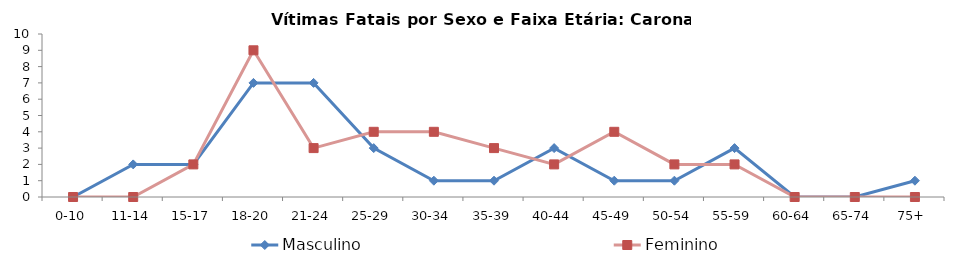
| Category | Masculino | Feminino |
|---|---|---|
| 0-10 | 0 | 0 |
| 11-14 | 2 | 0 |
| 15-17 | 2 | 2 |
| 18-20 | 7 | 9 |
| 21-24 | 7 | 3 |
| 25-29 | 3 | 4 |
| 30-34 | 1 | 4 |
| 35-39 | 1 | 3 |
| 40-44 | 3 | 2 |
| 45-49 | 1 | 4 |
| 50-54 | 1 | 2 |
| 55-59 | 3 | 2 |
| 60-64 | 0 | 0 |
| 65-74 | 0 | 0 |
| 75+ | 1 | 0 |